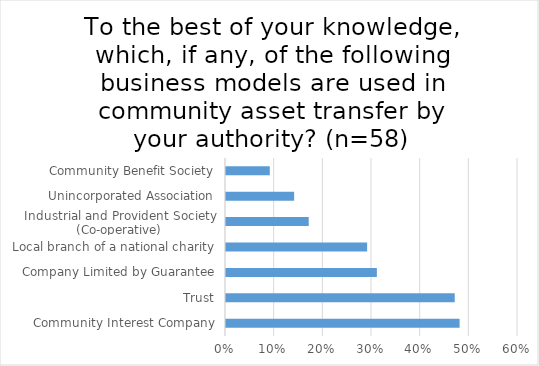
| Category | Series 0 |
|---|---|
| Community Interest Company | 0.48 |
| Trust | 0.47 |
| Company Limited by Guarantee | 0.31 |
| Local branch of a national charity | 0.29 |
| Industrial and Provident Society (Co-operative) | 0.17 |
| Unincorporated Association | 0.14 |
| Community Benefit Society | 0.09 |